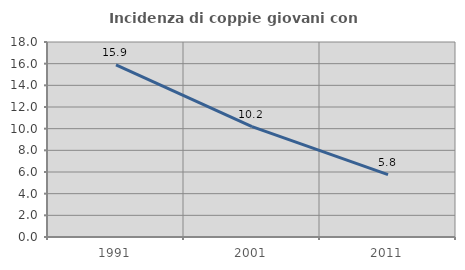
| Category | Incidenza di coppie giovani con figli |
|---|---|
| 1991.0 | 15.884 |
| 2001.0 | 10.187 |
| 2011.0 | 5.752 |